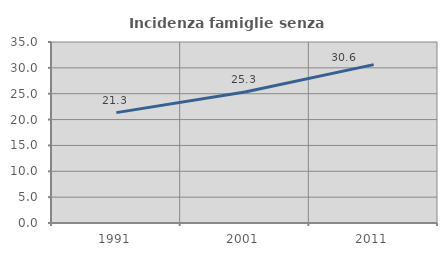
| Category | Incidenza famiglie senza nuclei |
|---|---|
| 1991.0 | 21.341 |
| 2001.0 | 25.345 |
| 2011.0 | 30.63 |